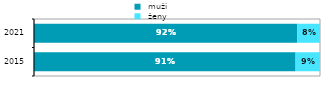
| Category |  muži |  ženy |
|---|---|---|
| 2015.0 | 0.915 | 0.085 |
| 2021.0 | 0.921 | 0.079 |